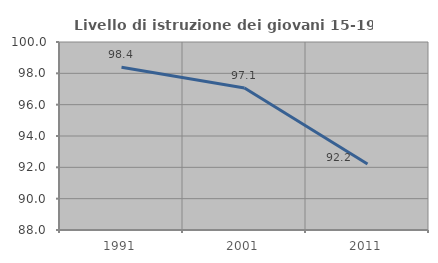
| Category | Livello di istruzione dei giovani 15-19 anni |
|---|---|
| 1991.0 | 98.387 |
| 2001.0 | 97.059 |
| 2011.0 | 92.208 |